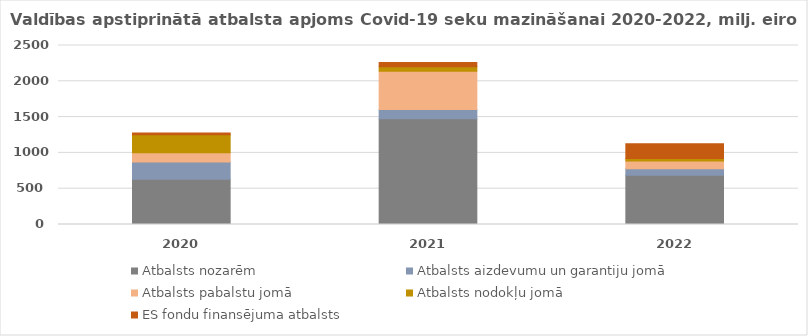
| Category | Atbalsts nozarēm | Atbalsts aizdevumu un garantiju jomā | Atbalsts pabalstu jomā | Atbalsts nodokļu jomā | ES fondu finansējuma atbalsts |
|---|---|---|---|---|---|
| 2020.0 | 631.794 | 239.964 | 129.588 | 250.993 | 27.258 |
| 2021.0 | 1475.737 | 130.716 | 533.456 | 62.55 | 59.749 |
| 2022.0 | 686.321 | 91.188 | 109.632 | 35.5 | 203.861 |